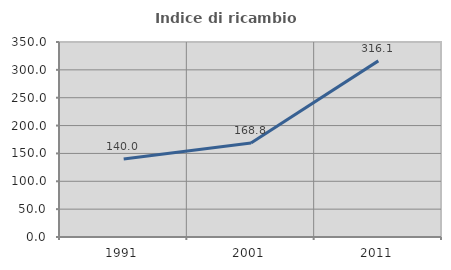
| Category | Indice di ricambio occupazionale  |
|---|---|
| 1991.0 | 140 |
| 2001.0 | 168.817 |
| 2011.0 | 316.129 |